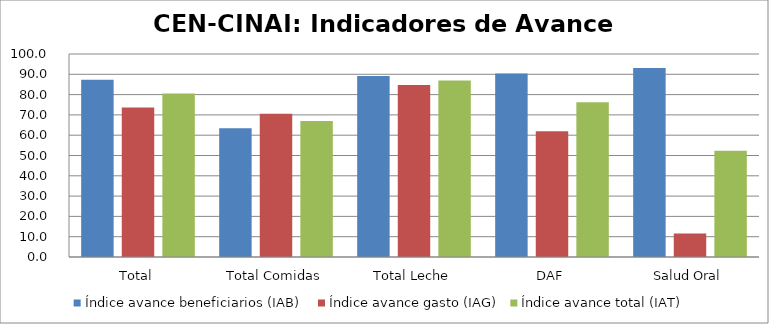
| Category | Índice avance beneficiarios (IAB)  | Índice avance gasto (IAG) | Índice avance total (IAT)  |
|---|---|---|---|
| Total | 87.341 | 73.705 | 80.523 |
| Total Comidas | 63.427 | 70.593 | 67.01 |
| Total Leche | 89.142 | 84.767 | 86.954 |
| DAF | 90.402 | 62.005 | 76.204 |
| Salud Oral | 93.15 | 11.615 | 52.383 |